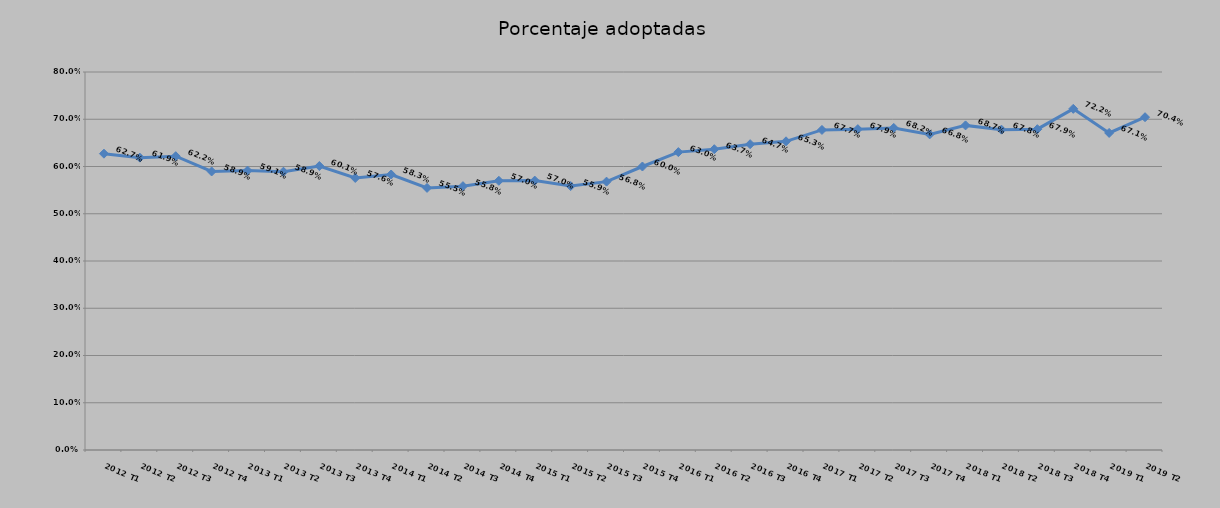
| Category | Porcentaje adoptadas |
|---|---|
| 2012 T1 | 0.627 |
| 2012 T2 | 0.619 |
| 2012 T3 | 0.622 |
| 2012 T4 | 0.589 |
| 2013 T1 | 0.591 |
| 2013 T2 | 0.589 |
| 2013 T3 | 0.601 |
| 2013 T4 | 0.576 |
| 2014 T1 | 0.583 |
| 2014 T2 | 0.555 |
| 2014 T3 | 0.558 |
| 2014 T4 | 0.57 |
| 2015 T1 | 0.57 |
| 2015 T2 | 0.559 |
| 2015 T3 | 0.568 |
| 2015 T4 | 0.6 |
| 2016 T1 | 0.63 |
| 2016 T2 | 0.637 |
| 2016 T3 | 0.647 |
| 2016 T4 | 0.653 |
| 2017 T1 | 0.677 |
| 2017 T2 | 0.679 |
| 2017 T3 | 0.682 |
| 2017 T4 | 0.668 |
| 2018 T1 | 0.687 |
| 2018 T2 | 0.678 |
| 2018 T3 | 0.679 |
| 2018 T4 | 0.722 |
| 2019 T1 | 0.671 |
| 2019 T2 | 0.704 |